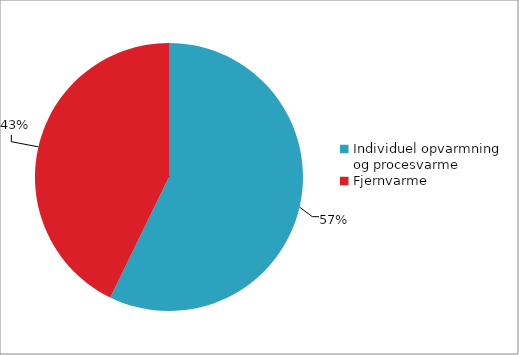
| Category | Series 0 |
|---|---|
| Individuel opvarmning og procesvarme | 331252 |
| Fjernvarme | 247655 |